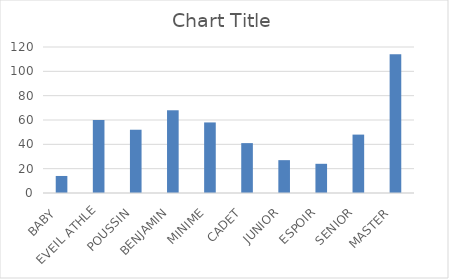
| Category | Series 0 |
|---|---|
| BABY  | 14 |
| EVEIL ATHLE | 60 |
| POUSSIN  | 52 |
| BENJAMIN  | 68 |
| MINIME  | 58 |
| CADET  | 41 |
| JUNIOR  | 27 |
| ESPOIR  | 24 |
| SENIOR  | 48 |
| MASTER  | 114 |